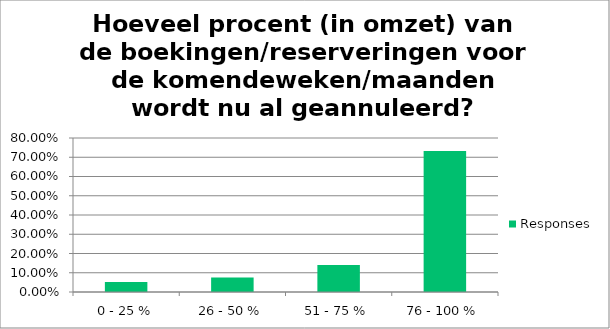
| Category | Responses |
|---|---|
| 0 - 25 % | 0.051 |
| 26 - 50 % | 0.076 |
| 51 - 75 % | 0.141 |
| 76 - 100 % | 0.732 |